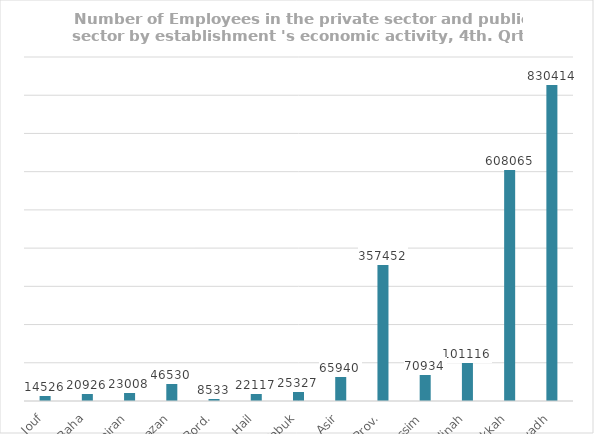
| Category | Series 0 | Series 1 | Series 2 | Series 3 | Series 4 | Series 5 | Series 6 | Series 7 | Series 8 | Series 9 | Series 10 | Series 11 | Series 12 |
|---|---|---|---|---|---|---|---|---|---|---|---|---|---|
| Riyadh | 830414 |  |  |  |  |  |  |  |  |  |  |  |  |
| Makkah | 608065 |  |  |  |  |  |  |  |  |  |  |  |  |
| Madinah | 101116 |  |  |  |  |  |  |  |  |  |  |  |  |
| Qassim | 70934 |  |  |  |  |  |  |  |  |  |  |  |  |
| Easte. Prov. | 357452 |  |  |  |  |  |  |  |  |  |  |  |  |
| Asir | 65940 |  |  |  |  |  |  |  |  |  |  |  |  |
| Tabuk | 25327 |  |  |  |  |  |  |  |  |  |  |  |  |
| Hail | 22117 |  |  |  |  |  |  |  |  |  |  |  |  |
| North.Bord. | 8533 |  |  |  |  |  |  |  |  |  |  |  |  |
| Jazan | 46530 |  |  |  |  |  |  |  |  |  |  |  |  |
| Najran | 23008 |  |  |  |  |  |  |  |  |  |  |  |  |
| AL - Baha | 20926 |  |  |  |  |  |  |  |  |  |  |  |  |
| AL - Jouf | 14526 |  |  |  |  |  |  |  |  |  |  |  |  |